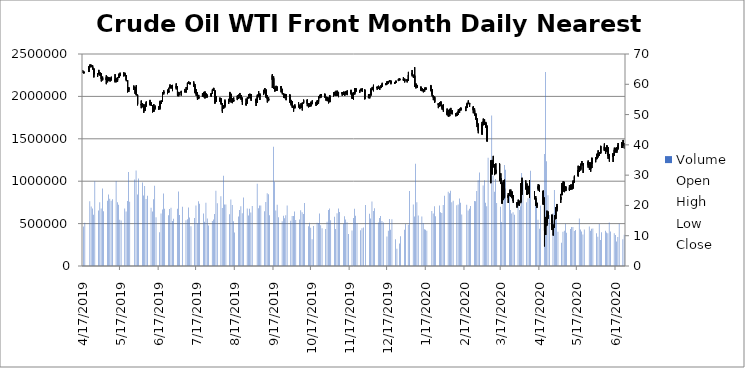
| Category | Volume |
|---|---|
| 4/17/19 | 466682 |
| 4/18/19 | 508981 |
| 4/22/19 | 763527 |
| 4/23/19 | 700598 |
| 4/24/19 | 678386 |
| 4/25/19 | 603001 |
| 4/26/19 | 1000836 |
| 4/29/19 | 654076 |
| 4/30/19 | 750494 |
| 5/1/19 | 676872 |
| 5/2/19 | 914661 |
| 5/3/19 | 646866 |
| 5/6/19 | 768810 |
| 5/7/19 | 842810 |
| 5/8/19 | 791769 |
| 5/9/19 | 769583 |
| 5/10/19 | 786494 |
| 5/13/19 | 1003106 |
| 5/14/19 | 751668 |
| 5/15/19 | 723001 |
| 5/16/19 | 545679 |
| 5/17/19 | 537033 |
| 5/20/19 | 678773 |
| 5/21/19 | 641680 |
| 5/22/19 | 766728 |
| 5/23/19 | 1108052 |
| 5/24/19 | 758099 |
| 5/28/19 | 1020323 |
| 5/29/19 | 1124959 |
| 5/30/19 | 842281 |
| 5/31/19 | 1031488 |
| 6/3/19 | 984308 |
| 6/4/19 | 831625 |
| 6/5/19 | 943186 |
| 6/6/19 | 790067 |
| 6/7/19 | 828133 |
| 6/10/19 | 687146 |
| 6/11/19 | 642940 |
| 6/12/19 | 786105 |
| 6/13/19 | 945024 |
| 6/14/19 | 574229 |
| 6/17/19 | 397868 |
| 6/18/19 | 618302 |
| 6/19/19 | 667512 |
| 6/20/19 | 854514 |
| 6/21/19 | 676047 |
| 6/24/19 | 597164 |
| 6/25/19 | 673140 |
| 6/26/19 | 686817 |
| 6/27/19 | 531405 |
| 6/28/19 | 556101 |
| 7/1/19 | 674887 |
| 7/2/19 | 878938 |
| 7/3/19 | 600131 |
| 7/5/19 | 698015 |
| 7/8/19 | 540861 |
| 7/9/19 | 551872 |
| 7/10/19 | 690656 |
| 7/11/19 | 573019 |
| 7/12/19 | 469029 |
| 7/15/19 | 566818 |
| 7/16/19 | 712540 |
| 7/17/19 | 504432 |
| 7/18/19 | 764491 |
| 7/19/19 | 734388 |
| 7/22/19 | 619483 |
| 7/23/19 | 521876 |
| 7/24/19 | 745248 |
| 7/25/19 | 559282 |
| 7/26/19 | 476785 |
| 7/29/19 | 529742 |
| 7/30/19 | 547401 |
| 7/31/19 | 614001 |
| 8/1/19 | 886748 |
| 8/2/19 | 739810 |
| 8/5/19 | 823844 |
| 8/6/19 | 682794 |
| 8/7/19 | 1063214 |
| 8/8/19 | 724762 |
| 8/9/19 | 726386 |
| 8/12/19 | 611027 |
| 8/13/19 | 783486 |
| 8/14/19 | 718293 |
| 8/15/19 | 527866 |
| 8/16/19 | 395156 |
| 8/19/19 | 584014 |
| 8/20/19 | 659258 |
| 8/21/19 | 704035 |
| 8/22/19 | 621573 |
| 8/23/19 | 807151 |
| 8/26/19 | 679022 |
| 8/27/19 | 596624 |
| 8/28/19 | 674048 |
| 8/29/19 | 630760 |
| 8/30/19 | 708268 |
| 9/3/19 | 970804 |
| 9/4/19 | 682298 |
| 9/5/19 | 712466 |
| 9/6/19 | 714294 |
| 9/9/19 | 646993 |
| 9/10/19 | 755472 |
| 9/11/19 | 858772 |
| 9/12/19 | 845977 |
| 9/13/19 | 599470 |
| 9/16/19 | 1404916 |
| 9/17/19 | 993237 |
| 9/18/19 | 654343 |
| 9/19/19 | 722337 |
| 9/20/19 | 576019 |
| 9/23/19 | 526785 |
| 9/24/19 | 591529 |
| 9/25/19 | 563550 |
| 9/26/19 | 599653 |
| 9/27/19 | 712966 |
| 9/30/19 | 532522 |
| 10/1/19 | 589176 |
| 10/2/19 | 590306 |
| 10/3/19 | 642466 |
| 10/4/19 | 541104 |
| 10/7/19 | 549019 |
| 10/8/19 | 658324 |
| 10/9/19 | 632666 |
| 10/10/19 | 613944 |
| 10/11/19 | 741704 |
| 10/14/19 | 467643 |
| 10/15/19 | 511249 |
| 10/16/19 | 451643 |
| 10/17/19 | 316374 |
| 10/18/19 | 472558 |
| 10/21/19 | 509426 |
| 10/22/19 | 506573 |
| 10/23/19 | 620202 |
| 10/24/19 | 480764 |
| 10/25/19 | 445020 |
| 10/28/19 | 437020 |
| 10/29/19 | 521457 |
| 10/30/19 | 659328 |
| 10/31/19 | 677419 |
| 11/1/19 | 538117 |
| 11/4/19 | 580350 |
| 11/5/19 | 435319 |
| 11/6/19 | 623258 |
| 11/7/19 | 678165 |
| 11/8/19 | 636941 |
| 11/11/19 | 498981 |
| 11/12/19 | 586568 |
| 11/13/19 | 547635 |
| 11/14/19 | 516832 |
| 11/15/19 | 375993 |
| 11/18/19 | 420045 |
| 11/19/19 | 566256 |
| 11/20/19 | 674891 |
| 11/21/19 | 593533 |
| 11/22/19 | 508244 |
| 11/25/19 | 420642 |
| 11/26/19 | 443816 |
| 11/27/19 | 454256 |
| 11/29/19 | 718724 |
| 12/2/19 | 616423 |
| 12/3/19 | 560554 |
| 12/4/19 | 760541 |
| 12/5/19 | 649461 |
| 12/6/19 | 679609 |
| 12/9/19 | 511561 |
| 12/10/19 | 566822 |
| 12/11/19 | 589650 |
| 12/12/19 | 530851 |
| 12/13/19 | 512288 |
| 12/16/19 | 347395 |
| 12/17/19 | 416419 |
| 12/18/19 | 553568 |
| 12/19/19 | 426341 |
| 12/20/19 | 552517 |
| 12/23/19 | 314711 |
| 12/24/19 | 204535 |
| 12/26/19 | 265091 |
| 12/27/19 | 351899 |
| 12/30/19 | 427149 |
| 12/31/19 | 494535 |
| 1/2/20 | 486873 |
| 1/3/20 | 885861 |
| 1/6/20 | 724236 |
| 1/7/20 | 582649 |
| 1/8/20 | 1205710 |
| 1/9/20 | 750933 |
| 1/10/20 | 596186 |
| 1/13/20 | 584002 |
| 1/14/20 | 507714 |
| 1/15/20 | 433169 |
| 1/16/20 | 426333 |
| 1/17/20 | 415846 |
| 1/21/20 | 648335 |
| 1/22/20 | 620119 |
| 1/23/20 | 703995 |
| 1/24/20 | 586195 |
| 1/27/20 | 712880 |
| 1/28/20 | 633963 |
| 1/29/20 | 624979 |
| 1/30/20 | 720123 |
| 1/31/20 | 827907 |
| 2/3/20 | 876044 |
| 2/4/20 | 859357 |
| 2/5/20 | 887946 |
| 2/6/20 | 750659 |
| 2/7/20 | 768345 |
| 2/10/20 | 715894 |
| 2/11/20 | 725733 |
| 2/12/20 | 795256 |
| 2/13/20 | 745400 |
| 2/14/20 | 607343 |
| 2/18/20 | 723143 |
| 2/19/20 | 655495 |
| 2/20/20 | 676179 |
| 2/21/20 | 707555 |
| 2/24/20 | 765515 |
| 2/25/20 | 764989 |
| 2/26/20 | 884482 |
| 2/27/20 | 1011915 |
| 2/28/20 | 1101659 |
| 3/2/20 | 949471 |
| 3/3/20 | 1011933 |
| 3/4/20 | 745856 |
| 3/5/20 | 704591 |
| 3/6/20 | 1276180 |
| 3/9/20 | 1774383 |
| 3/10/20 | 1064632 |
| 3/11/20 | 874646 |
| 3/12/20 | 1025036 |
| 3/13/20 | 743129 |
| 3/16/20 | 698829 |
| 3/17/20 | 520078 |
| 3/18/20 | 1001245 |
| 3/19/20 | 1191520 |
| 3/20/20 | 1133808 |
| 3/23/20 | 852951 |
| 3/24/20 | 659697 |
| 3/25/20 | 618725 |
| 3/26/20 | 633877 |
| 3/27/20 | 603124 |
| 3/30/20 | 758711 |
| 3/31/20 | 660082 |
| 4/1/20 | 703286 |
| 4/2/20 | 1095972 |
| 4/3/20 | 1007577 |
| 4/6/20 | 752710 |
| 4/7/20 | 797707 |
| 4/8/20 | 823554 |
| 4/9/20 | 1122149 |
| 4/13/20 | 775120 |
| 4/14/20 | 785478 |
| 4/15/20 | 544797 |
| 4/16/20 | 439665 |
| 4/17/20 | 712975 |
| 4/20/20 | 1319926 |
| 4/21/20 | 2288230 |
| 4/22/20 | 1235218 |
| 4/23/20 | 833584 |
| 4/24/20 | 600220 |
| 4/27/20 | 623201 |
| 4/28/20 | 897087 |
| 4/29/20 | 554134 |
| 4/30/20 | 545344 |
| 5/1/20 | 403201 |
| 5/4/20 | 274818 |
| 5/5/20 | 405071 |
| 5/6/20 | 414930 |
| 5/7/20 | 497356 |
| 5/8/20 | 392790 |
| 5/11/20 | 436580 |
| 5/12/20 | 459486 |
| 5/13/20 | 460735 |
| 5/14/20 | 413435 |
| 5/15/20 | 425167 |
| 5/18/20 | 561527 |
| 5/19/20 | 430823 |
| 5/20/20 | 406431 |
| 5/21/20 | 372814 |
| 5/22/20 | 429036 |
| 5/26/20 | 466737 |
| 5/27/20 | 415246 |
| 5/28/20 | 440168 |
| 5/29/20 | 443647 |
| 6/1/20 | 385710 |
| 6/2/20 | 343483 |
| 6/3/20 | 494253 |
| 6/4/20 | 307612 |
| 6/5/20 | 396856 |
| 6/8/20 | 416639 |
| 6/9/20 | 396033 |
| 6/10/20 | 385868 |
| 6/11/20 | 513912 |
| 6/12/20 | 406508 |
| 6/15/20 | 387546 |
| 6/16/20 | 366323 |
| 6/17/20 | 289579 |
| 6/18/20 | 341476 |
| 6/19/20 | 497181 |
| 6/22/20 | 315264 |
| 6/23/20 | 368730 |
| 6/24/20 | 209956 |